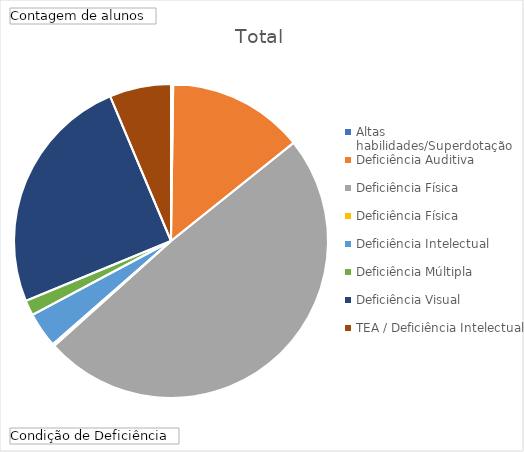
| Category | Total |
|---|---|
| Altas habilidades/Superdotação | 1 |
| Deficiência Auditiva | 62 |
| Deficiência Física | 217 |
| Deficiência Física  | 1 |
| Deficiência Intelectual | 16 |
| Deficiência Múltipla | 7 |
| Deficiência Visual | 110 |
| TEA / Deficiência Intelectual | 28 |